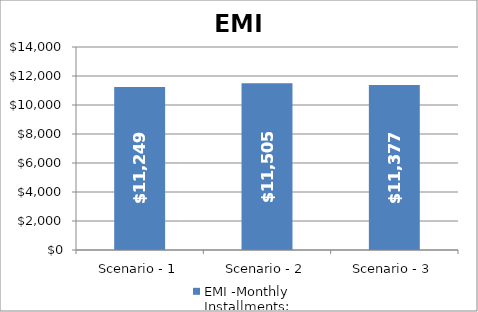
| Category | EMI -Monthly Installments: |
|---|---|
| Scenario - 1 | 11248.97 |
| Scenario - 2 | 11504.93 |
| Scenario - 3 | 11376.54 |